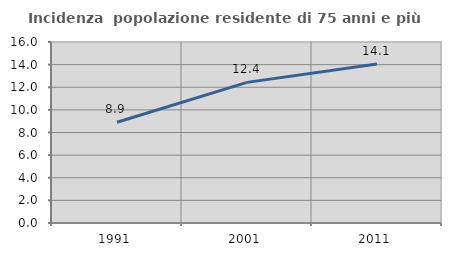
| Category | Incidenza  popolazione residente di 75 anni e più |
|---|---|
| 1991.0 | 8.908 |
| 2001.0 | 12.432 |
| 2011.0 | 14.052 |